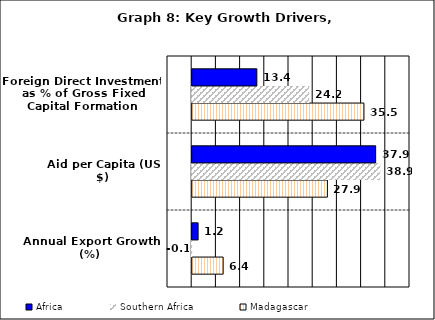
| Category | Madagascar | Southern Africa | Africa |
|---|---|---|---|
| Annual Export Growth (%) | 6.399 | -0.056 | 1.219 |
| Aid per Capita (US $) | 27.933 | 38.854 | 37.904 |
| Foreign Direct Investment as % of Gross Fixed Capital Formation | 35.484 | 24.179 | 13.354 |